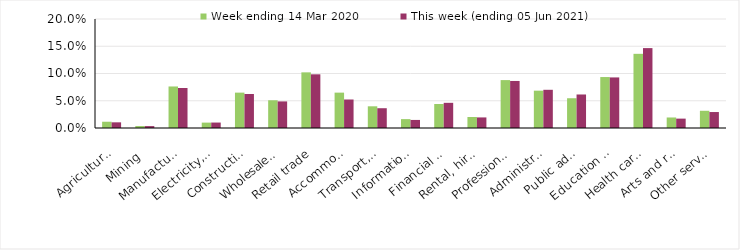
| Category | Week ending 14 Mar 2020 | This week (ending 05 Jun 2021) |
|---|---|---|
| Agriculture, forestry and fishing | 0.012 | 0.01 |
| Mining | 0.004 | 0.004 |
| Manufacturing | 0.076 | 0.073 |
| Electricity, gas, water and waste services | 0.01 | 0.01 |
| Construction | 0.065 | 0.062 |
| Wholesale trade | 0.051 | 0.049 |
| Retail trade | 0.102 | 0.098 |
| Accommodation and food services | 0.065 | 0.052 |
| Transport, postal and warehousing | 0.04 | 0.036 |
| Information media and telecommunications | 0.016 | 0.015 |
| Financial and insurance services | 0.044 | 0.046 |
| Rental, hiring and real estate services | 0.02 | 0.019 |
| Professional, scientific and technical services | 0.088 | 0.086 |
| Administrative and support services | 0.068 | 0.07 |
| Public administration and safety | 0.055 | 0.062 |
| Education and training | 0.094 | 0.093 |
| Health care and social assistance | 0.136 | 0.147 |
| Arts and recreation services | 0.019 | 0.017 |
| Other services | 0.032 | 0.029 |